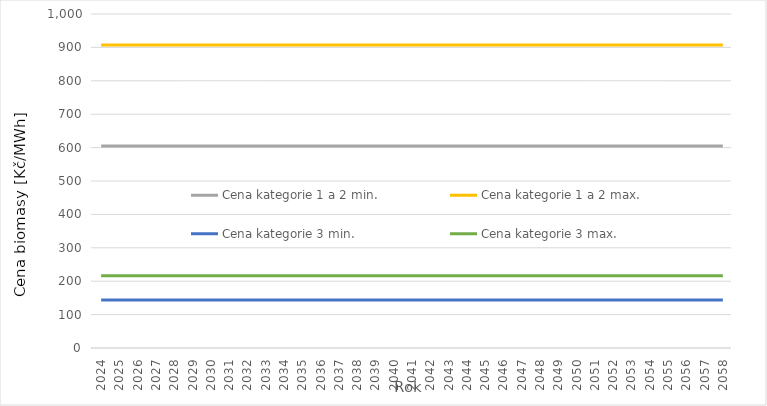
| Category | Cena kategorie 1 a 2 min. | Cena kategorie 1 a 2 max. | Cena kategorie 3 min. | Cena kategorie 3 max. |
|---|---|---|---|---|
| 2024.0 | 604.8 | 907.2 | 144 | 216 |
| 2025.0 | 604.8 | 907.2 | 144 | 216 |
| 2026.0 | 604.8 | 907.2 | 144 | 216 |
| 2027.0 | 604.8 | 907.2 | 144 | 216 |
| 2028.0 | 604.8 | 907.2 | 144 | 216 |
| 2029.0 | 604.8 | 907.2 | 144 | 216 |
| 2030.0 | 604.8 | 907.2 | 144 | 216 |
| 2031.0 | 604.8 | 907.2 | 144 | 216 |
| 2032.0 | 604.8 | 907.2 | 144 | 216 |
| 2033.0 | 604.8 | 907.2 | 144 | 216 |
| 2034.0 | 604.8 | 907.2 | 144 | 216 |
| 2035.0 | 604.8 | 907.2 | 144 | 216 |
| 2036.0 | 604.8 | 907.2 | 144 | 216 |
| 2037.0 | 604.8 | 907.2 | 144 | 216 |
| 2038.0 | 604.8 | 907.2 | 144 | 216 |
| 2039.0 | 604.8 | 907.2 | 144 | 216 |
| 2040.0 | 604.8 | 907.2 | 144 | 216 |
| 2041.0 | 604.8 | 907.2 | 144 | 216 |
| 2042.0 | 604.8 | 907.2 | 144 | 216 |
| 2043.0 | 604.8 | 907.2 | 144 | 216 |
| 2044.0 | 604.8 | 907.2 | 144 | 216 |
| 2045.0 | 604.8 | 907.2 | 144 | 216 |
| 2046.0 | 604.8 | 907.2 | 144 | 216 |
| 2047.0 | 604.8 | 907.2 | 144 | 216 |
| 2048.0 | 604.8 | 907.2 | 144 | 216 |
| 2049.0 | 604.8 | 907.2 | 144 | 216 |
| 2050.0 | 604.8 | 907.2 | 144 | 216 |
| 2051.0 | 604.8 | 907.2 | 144 | 216 |
| 2052.0 | 604.8 | 907.2 | 144 | 216 |
| 2053.0 | 604.8 | 907.2 | 144 | 216 |
| 2054.0 | 604.8 | 907.2 | 144 | 216 |
| 2055.0 | 604.8 | 907.2 | 144 | 216 |
| 2056.0 | 604.8 | 907.2 | 144 | 216 |
| 2057.0 | 604.8 | 907.2 | 144 | 216 |
| 2058.0 | 604.8 | 907.2 | 144 | 216 |